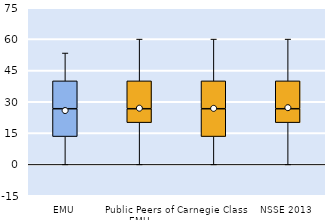
| Category | 25th | 50th | 75th |
|---|---|---|---|
| EMU | 13.333 | 13.333 | 13.333 |
| Public Peers of EMU | 20 | 6.667 | 13.333 |
| Carnegie Class | 13.333 | 13.333 | 13.333 |
| NSSE 2013 | 20 | 6.667 | 13.333 |